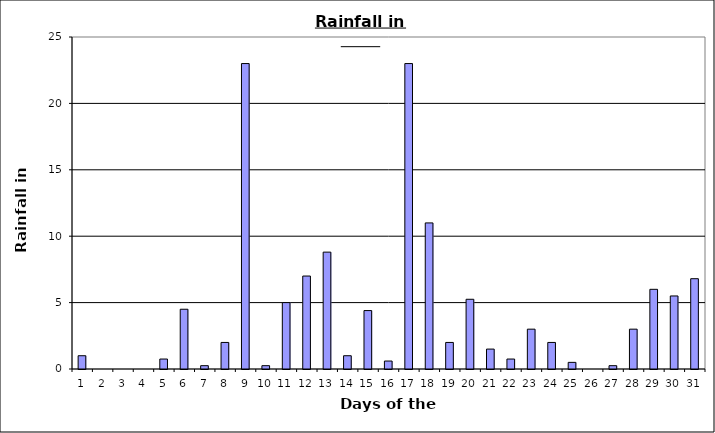
| Category | Series 0 |
|---|---|
| 0 | 1 |
| 1 | 0 |
| 2 | 0 |
| 3 | 0 |
| 4 | 0.75 |
| 5 | 4.5 |
| 6 | 0.25 |
| 7 | 2 |
| 8 | 23 |
| 9 | 0.25 |
| 10 | 5 |
| 11 | 7 |
| 12 | 8.8 |
| 13 | 1 |
| 14 | 4.4 |
| 15 | 0.6 |
| 16 | 23 |
| 17 | 11 |
| 18 | 2 |
| 19 | 5.25 |
| 20 | 1.5 |
| 21 | 0.75 |
| 22 | 3 |
| 23 | 2 |
| 24 | 0.5 |
| 25 | 0 |
| 26 | 0.25 |
| 27 | 3 |
| 28 | 6 |
| 29 | 5.5 |
| 30 | 6.8 |